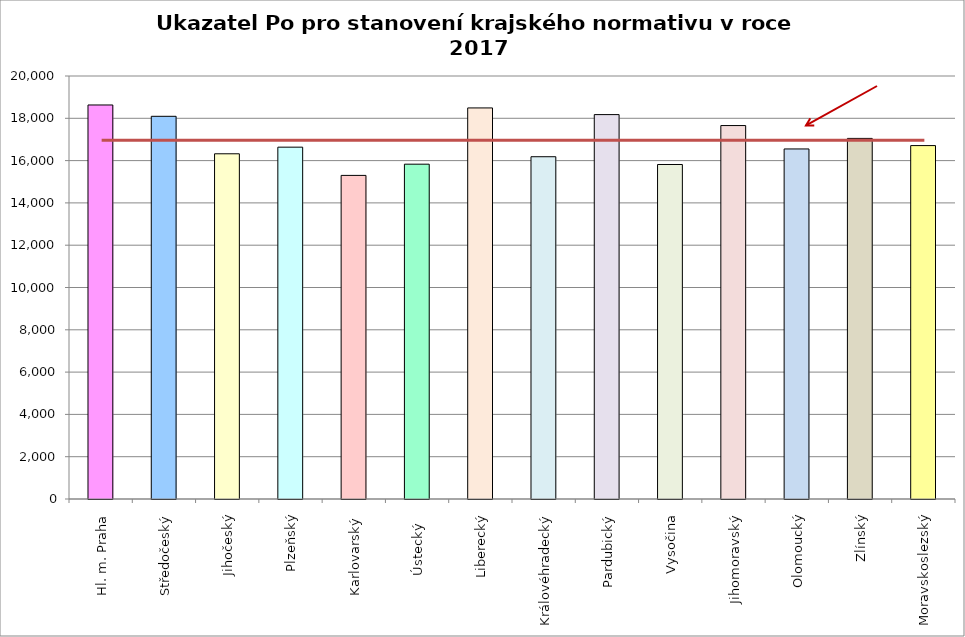
| Category | Series 0 |
|---|---|
| Hl. m. Praha | 18630 |
| Středočeský | 18094.2 |
| Jihočeský | 16322 |
| Plzeňský | 16635 |
| Karlovarský  | 15300 |
| Ústecký   | 15831 |
| Liberecký | 18490 |
| Královéhradecký | 16183 |
| Pardubický | 18175 |
| Vysočina | 15816 |
| Jihomoravský | 17657 |
| Olomoucký | 16551 |
| Zlínský | 17050 |
| Moravskoslezský | 16710 |